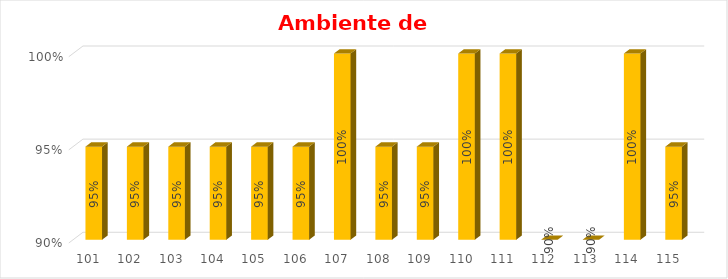
| Category | % Avance |
|---|---|
| 101.0 | 0.95 |
| 102.0 | 0.95 |
| 103.0 | 0.95 |
| 104.0 | 0.95 |
| 105.0 | 0.95 |
| 106.0 | 0.95 |
| 107.0 | 1 |
| 108.0 | 0.95 |
| 109.0 | 0.95 |
| 110.0 | 1 |
| 111.0 | 1 |
| 112.0 | 0.9 |
| 113.0 | 0.9 |
| 114.0 | 1 |
| 115.0 | 0.95 |